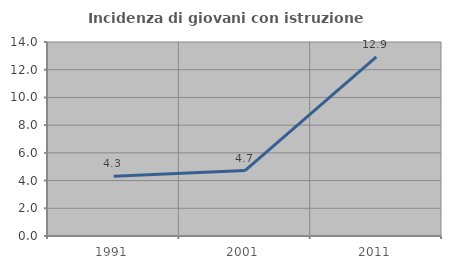
| Category | Incidenza di giovani con istruzione universitaria |
|---|---|
| 1991.0 | 4.31 |
| 2001.0 | 4.724 |
| 2011.0 | 12.925 |